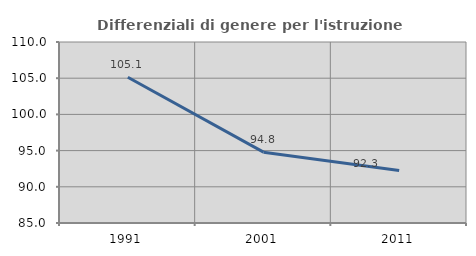
| Category | Differenziali di genere per l'istruzione superiore |
|---|---|
| 1991.0 | 105.134 |
| 2001.0 | 94.784 |
| 2011.0 | 92.258 |